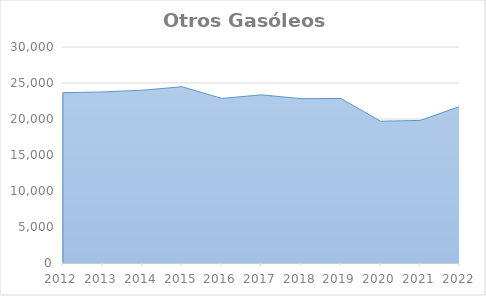
| Category | Otros Gasóleos |
|---|---|
| 2012.0 | 23655.098 |
| 2013.0 | 23759.561 |
| 2014.0 | 23998.256 |
| 2015.0 | 24477.329 |
| 2016.0 | 22853.852 |
| 2017.0 | 23356.296 |
| 2018.0 | 22827.504 |
| 2019.0 | 22851.346 |
| 2020.0 | 19692.742 |
| 2021.0 | 19803.856 |
| 2022.0 | 21751.308 |